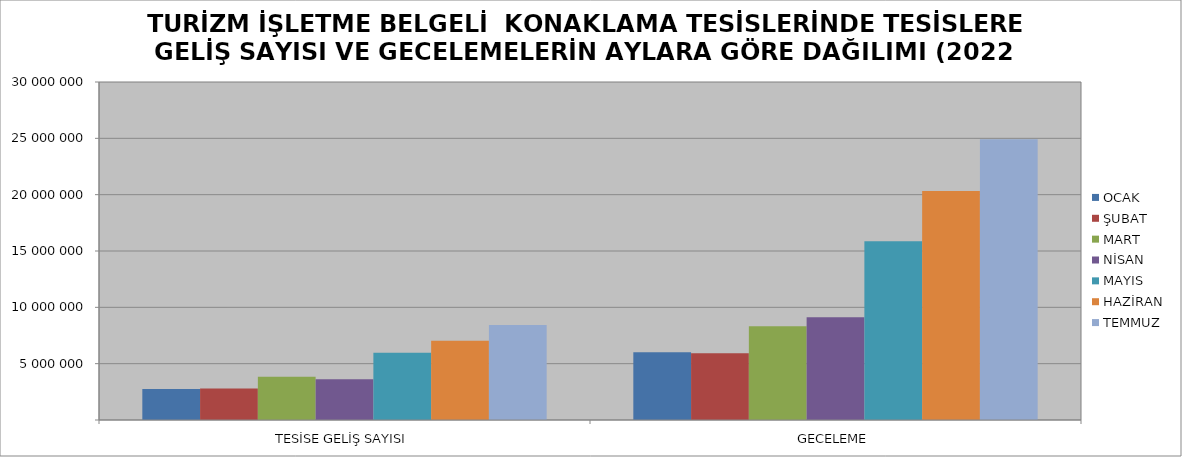
| Category | OCAK | ŞUBAT | MART | NİSAN | MAYIS | HAZİRAN | TEMMUZ |
|---|---|---|---|---|---|---|---|
| TESİSE GELİŞ SAYISI | 2752012 | 2800059 | 3828458 | 3612924 | 5975439 | 7040520 | 8433434 |
| GECELEME | 6020345 | 5929648 | 8312048 | 9130051 | 15857894 | 20320271 | 24913644 |